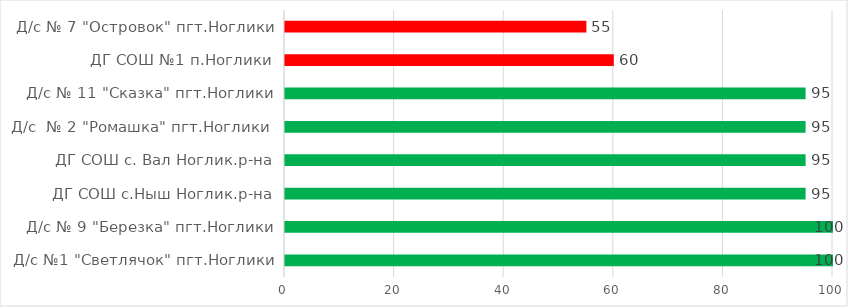
| Category | Series 0 |
|---|---|
| Д/с №1 "Светлячок" пгт.Ноглики | 100 |
| Д/с № 9 "Березка" пгт.Ноглики | 100 |
| ДГ СОШ с.Ныш Ноглик.р-на | 95 |
| ДГ СОШ с. Вал Ноглик.р-на | 95 |
| Д/с  № 2 "Ромашка" пгт.Ноглики  | 95 |
| Д/с № 11 "Сказка" пгт.Ноглики | 95 |
| ДГ СОШ №1 п.Ноглики | 60 |
| Д/с № 7 "Островок" пгт.Ноглики | 55 |